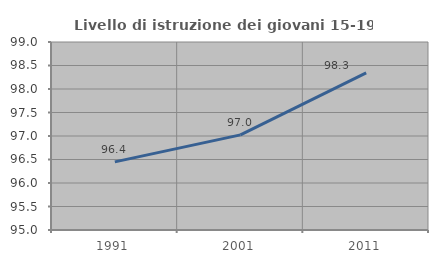
| Category | Livello di istruzione dei giovani 15-19 anni |
|---|---|
| 1991.0 | 96.45 |
| 2001.0 | 97.024 |
| 2011.0 | 98.343 |